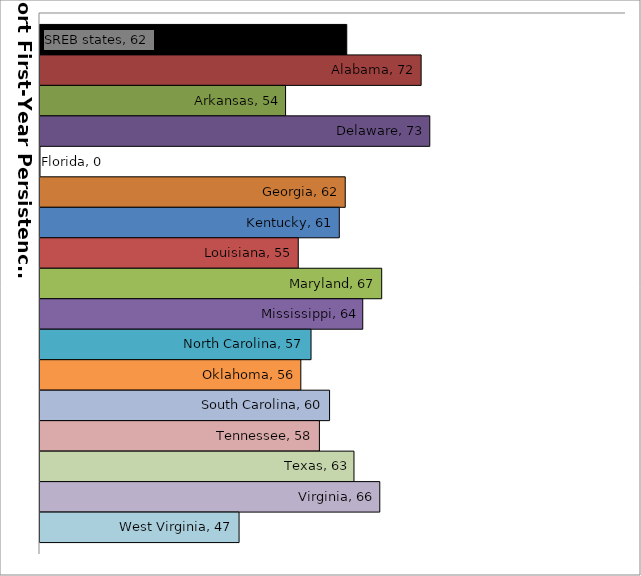
| Category | SREB states | Alabama | Arkansas | Delaware | Florida | Georgia | Kentucky | Louisiana | Maryland | Mississippi | North Carolina | Oklahoma | South Carolina | Tennessee | Texas | Virginia | West Virginia |
|---|---|---|---|---|---|---|---|---|---|---|---|---|---|---|---|---|---|
| 0 | 61.879 | 72.032 | 53.524 | 73.213 | 0 | 61.671 | 60.861 | 55.258 | 66.648 | 64.063 | 57.002 | 55.608 | 59.533 | 58.146 | 62.864 | 66.388 | 47.178 |